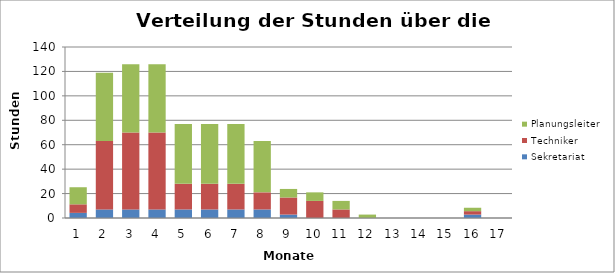
| Category | Sekretariat | Techniker | Planungsleiter |
|---|---|---|---|
| 1.0 | 4.198 | 6.996 | 13.992 |
| 2.0 | 6.996 | 55.97 | 55.97 |
| 3.0 | 6.996 | 62.966 | 55.97 |
| 4.0 | 6.996 | 62.966 | 55.97 |
| 5.0 | 6.996 | 20.989 | 48.974 |
| 6.0 | 6.996 | 20.989 | 48.974 |
| 7.0 | 6.996 | 20.989 | 48.974 |
| 8.0 | 6.996 | 13.992 | 41.977 |
| 9.0 | 2.798 | 13.992 | 6.996 |
| 10.0 | 0 | 13.992 | 6.996 |
| 11.0 | 0 | 6.996 | 6.996 |
| 12.0 | 0 | 0 | 2.798 |
| 13.0 | 0 | 0 | 0 |
| 14.0 | 0 | 0 | 0 |
| 15.0 | 0 | 0 | 0 |
| 16.0 | 2.798 | 2.798 | 2.798 |
| 17.0 | 0 | 0 | 0 |